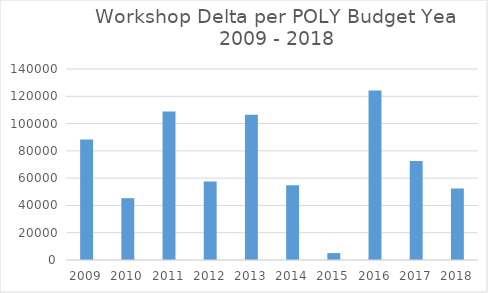
| Category | Series 0 |
|---|---|
| 2009.0 | 88288 |
| 2010.0 | 45303 |
| 2011.0 | 108811 |
| 2012.0 | 57561 |
| 2013.0 | 106486 |
| 2014.0 | 54881.98 |
| 2015.0 | 5077.06 |
| 2016.0 | 124326.45 |
| 2017.0 | 72636.08 |
| 2018.0 | 52389.3 |